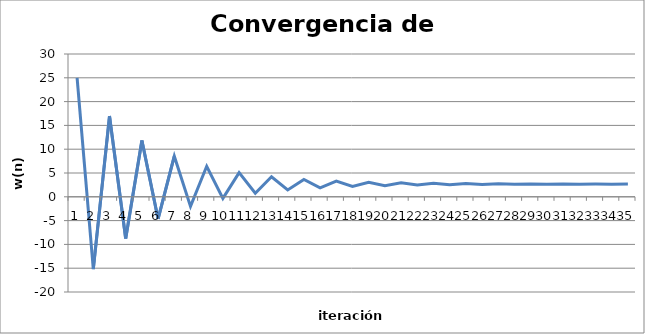
| Category | Series 0 |
|---|---|
| 0 | 25 |
| 1 | -15.2 |
| 2 | 16.96 |
| 3 | -8.768 |
| 4 | 11.814 |
| 5 | -4.652 |
| 6 | 8.521 |
| 7 | -2.017 |
| 8 | 6.414 |
| 9 | -0.331 |
| 10 | 5.065 |
| 11 | 0.748 |
| 12 | 4.201 |
| 13 | 1.439 |
| 14 | 3.649 |
| 15 | 1.881 |
| 16 | 3.295 |
| 17 | 2.164 |
| 18 | 3.069 |
| 19 | 2.345 |
| 20 | 2.924 |
| 21 | 2.461 |
| 22 | 2.831 |
| 23 | 2.535 |
| 24 | 2.772 |
| 25 | 2.582 |
| 26 | 2.734 |
| 27 | 2.613 |
| 28 | 2.71 |
| 29 | 2.632 |
| 30 | 2.694 |
| 31 | 2.645 |
| 32 | 2.684 |
| 33 | 2.653 |
| 34 | 2.678 |